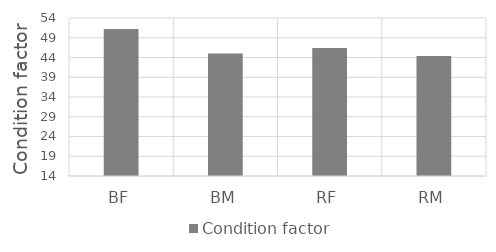
| Category | Condition factor |
|---|---|
| BF | 51.2 |
| BM | 45 |
| RF | 46.4 |
| RM | 44.4 |